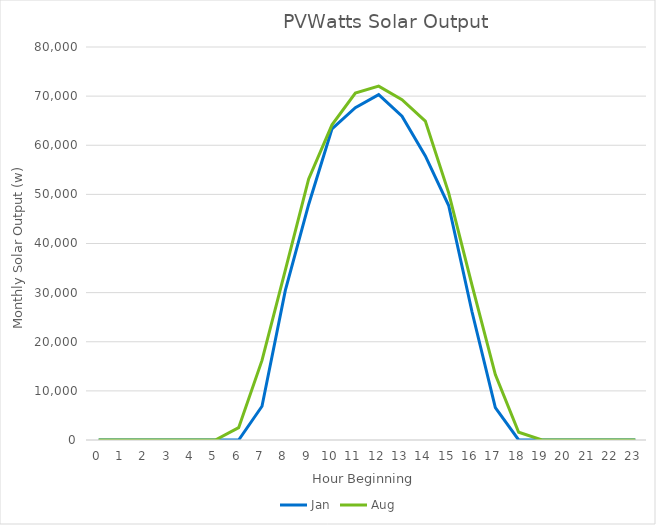
| Category | Jan | Aug |
|---|---|---|
| 0.0 | 0 | 0 |
| 1.0 | 0 | 0 |
| 2.0 | 0 | 0 |
| 3.0 | 0 | 0 |
| 4.0 | 0 | 0 |
| 5.0 | 0 | 0 |
| 6.0 | 0 | 2507.369 |
| 7.0 | 6868.09 | 16199.008 |
| 8.0 | 30448.546 | 34571.354 |
| 9.0 | 47943.268 | 53132.075 |
| 10.0 | 63337.209 | 64158.11 |
| 11.0 | 67654.665 | 70632.344 |
| 12.0 | 70304.917 | 72034.694 |
| 13.0 | 65901.757 | 69268.972 |
| 14.0 | 57821.639 | 64905.729 |
| 15.0 | 47736.131 | 50313.463 |
| 16.0 | 26108.608 | 31521.098 |
| 17.0 | 6583.978 | 13308.457 |
| 18.0 | 0 | 1572.051 |
| 19.0 | 0 | 0 |
| 20.0 | 0 | 0 |
| 21.0 | 0 | 0 |
| 22.0 | 0 | 0 |
| 23.0 | 0 | 0 |